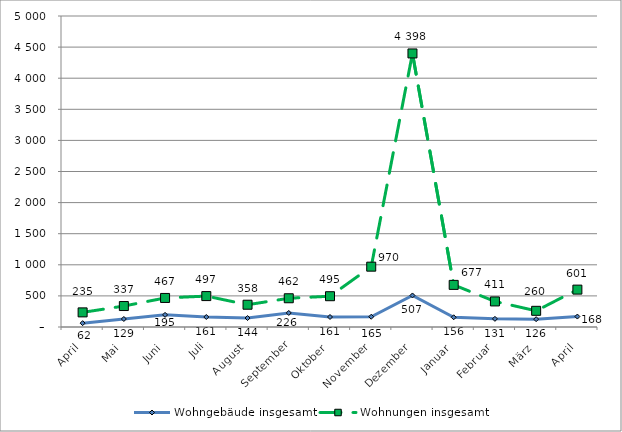
| Category | Wohngebäude insgesamt | Wohnungen insgesamt |
|---|---|---|
| April | 62 | 235 |
| Mai | 129 | 337 |
| Juni | 195 | 467 |
| Juli | 161 | 497 |
| August | 144 | 358 |
| September | 226 | 462 |
| Oktober | 161 | 495 |
| November | 165 | 970 |
| Dezember | 507 | 4398 |
| Januar | 156 | 677 |
| Februar | 131 | 411 |
| März | 126 | 260 |
| April | 168 | 601 |